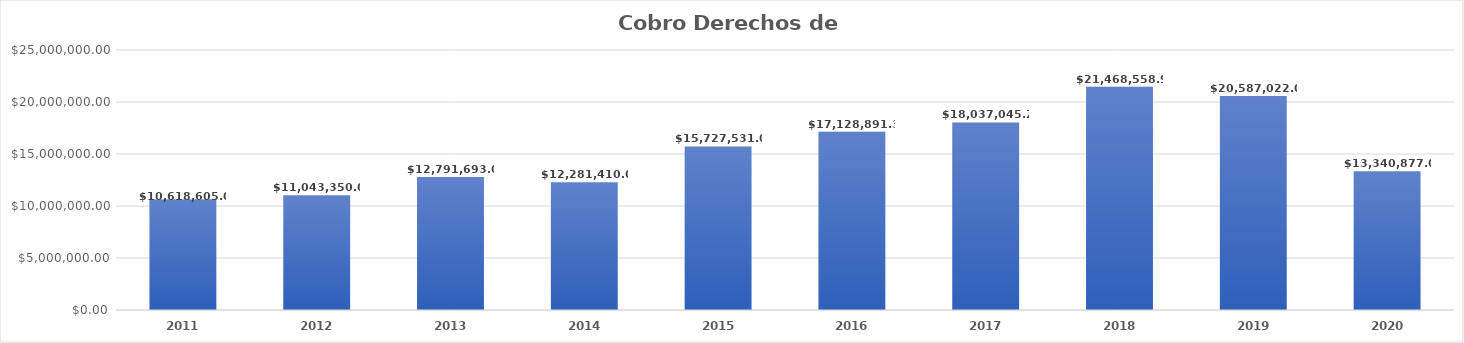
| Category | Cobro Derechos de Agua |
|---|---|
| 2011.0 | 10618605 |
| 2012.0 | 11043350 |
| 2013.0 | 12791693 |
| 2014.0 | 12281410 |
| 2015.0 | 15727531 |
| 2016.0 | 17128891.31 |
| 2017.0 | 18037045.24 |
| 2018.0 | 21468558.97 |
| 2019.0 | 20587022 |
| 2020.0 | 13340877 |